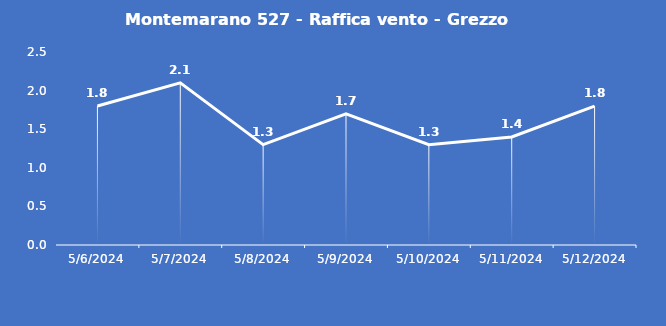
| Category | Montemarano 527 - Raffica vento - Grezzo (m/s) |
|---|---|
| 5/6/24 | 1.8 |
| 5/7/24 | 2.1 |
| 5/8/24 | 1.3 |
| 5/9/24 | 1.7 |
| 5/10/24 | 1.3 |
| 5/11/24 | 1.4 |
| 5/12/24 | 1.8 |